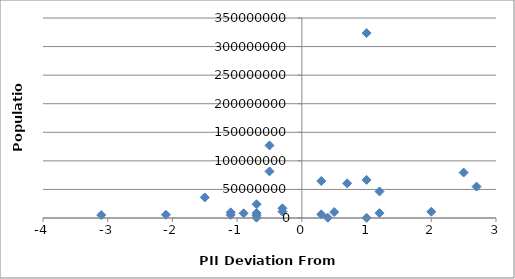
| Category | Population |
|---|---|
| -0.6999999999999997 | 24104700 |
| -0.6999999999999997 | 8662588 |
| -0.2999999999999998 | 11250585 |
| -1.5 | 36048521 |
| -2.0999999999999996 | 5707251 |
| -1.0999999999999996 | 5488543 |
| 1.0 | 66689000 |
| -0.5 | 81459000 |
| 2.0 | 10955000 |
| 1.0 | 332529 |
| 0.2999999999999998 | 6378000 |
| 1.2000000000000002 | 8502900 |
| 0.7000000000000002 | 60674003 |
| -0.5 | 126919659 |
| -0.6999999999999997 | 562958 |
| 0.40000000000000036 | 445426 |
| -0.2999999999999998 | 17000059 |
| -0.6999999999999997 | 4691480 |
| -3.0999999999999996 | 5214900 |
| 0.5 | 10427301 |
| 2.7 | 54956900 |
| 1.2000000000000002 | 46423064 |
| -1.0999999999999996 | 9875378 |
| -0.8999999999999999 | 8211700 |
| 2.5 | 79463663 |
| 0.2999999999999998 | 64716000 |
| 1.0 | 323625762 |